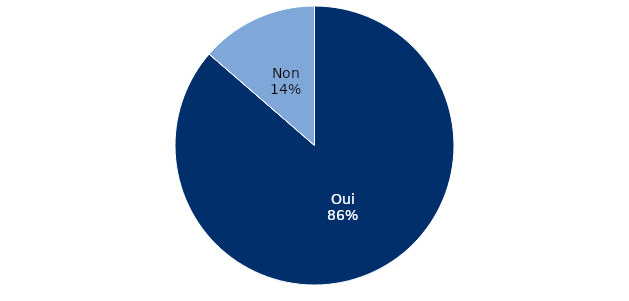
| Category | Occurrences |
|---|---|
| Oui | 38 |
| Non | 6 |